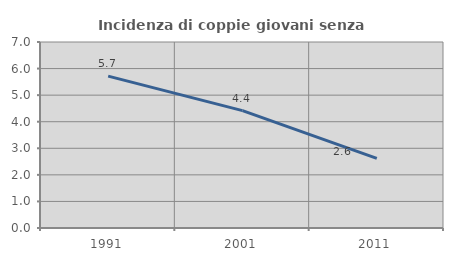
| Category | Incidenza di coppie giovani senza figli |
|---|---|
| 1991.0 | 5.716 |
| 2001.0 | 4.416 |
| 2011.0 | 2.621 |